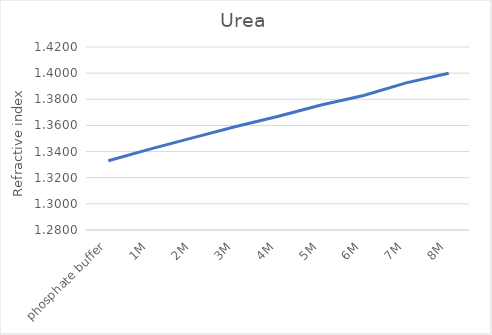
| Category | Series 0 |
|---|---|
| phosphate buffer | 1.333 |
| 1M | 1.342 |
| 2M | 1.351 |
| 3M | 1.359 |
| 4M | 1.367 |
| 5M | 1.376 |
| 6M | 1.383 |
| 7M | 1.393 |
| 8M | 1.4 |